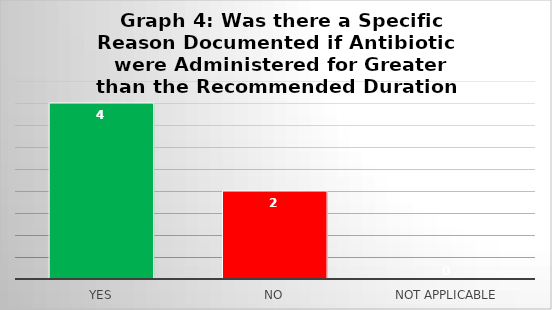
| Category | Series 0 |
|---|---|
| Yes | 4 |
| No | 2 |
| Not Applicable | 0 |